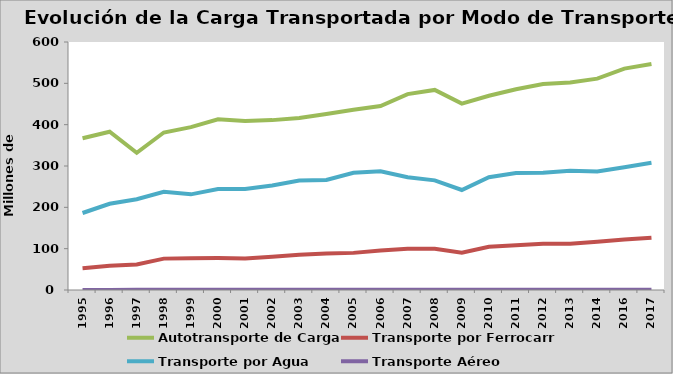
| Category | Autotransporte de Carga | Transporte por Ferrocarril | Transporte por Agua | Transporte Aéreo |
|---|---|---|---|---|
| 1995.0 | 367 | 52.48 | 186.26 | 0.252 |
| 1996.0 | 383 | 58.831 | 208.581 | 0.285 |
| 1997.0 | 332 | 61.666 | 219.653 | 0.335 |
| 1998.0 | 381 | 75.914 | 237.38 | 0.388 |
| 1999.0 | 394 | 77.062 | 231.44 | 0.407 |
| 2000.0 | 413 | 77.164 | 244.252 | 0.379 |
| 2001.0 | 409 | 76.182 | 244.431 | 0.351 |
| 2002.0 | 411 | 80.451 | 253.046 | 0.389 |
| 2003.0 | 416 | 85.168 | 264.739 | 0.41 |
| 2004.0 | 426 | 88.097 | 266.008 | 0.467 |
| 2005.0 | 436 | 89.814 | 283.604 | 0.529 |
| 2006.0 | 445 | 95.713 | 287.432 | 0.544 |
| 2007.0 | 474 | 99.845 | 272.934 | 0.572 |
| 2008.0 | 484 | 99.692 | 265.237 | 0.525 |
| 2009.0 | 451 | 90.321 | 241.923 | 0.466 |
| 2010.0 | 470 | 104.564 | 272.811 | 0.571 |
| 2011.0 | 485.502 | 108.433 | 282.902 | 0.562 |
| 2012.0 | 498.147 | 111.607 | 283.462 | 0.559 |
| 2013.0 | 502.15 | 111.933 | 288.696 | 0.582 |
| 2014.0 | 511.34 | 116.936 | 286.761 | 0.618 |
| 2016.0 | 535.548 | 121.968 | 297.199 | 0.685 |
| 2017.0 | 546.588 | 126.585 | 307.642 | 0.74 |